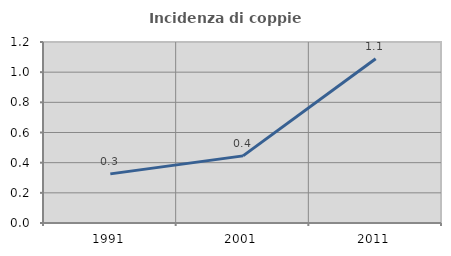
| Category | Incidenza di coppie miste |
|---|---|
| 1991.0 | 0.326 |
| 2001.0 | 0.445 |
| 2011.0 | 1.089 |